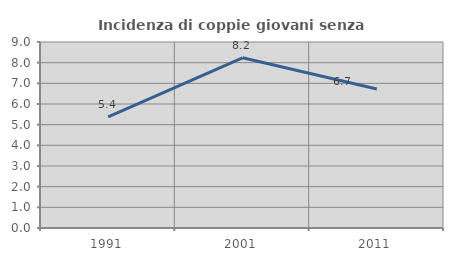
| Category | Incidenza di coppie giovani senza figli |
|---|---|
| 1991.0 | 5.376 |
| 2001.0 | 8.234 |
| 2011.0 | 6.73 |